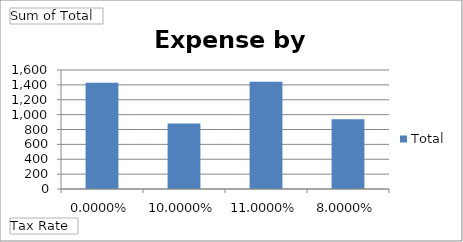
| Category | Total |
|---|---|
| 0.0000% | 1430 |
| 10.0000% | 880 |
| 11.0000% | 1443 |
| 8.0000% | 939.33 |